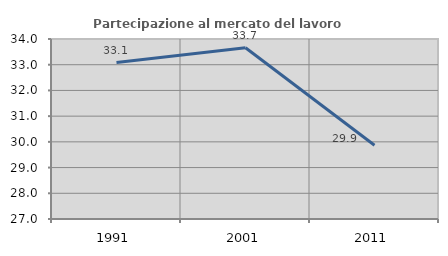
| Category | Partecipazione al mercato del lavoro  femminile |
|---|---|
| 1991.0 | 33.086 |
| 2001.0 | 33.659 |
| 2011.0 | 29.87 |